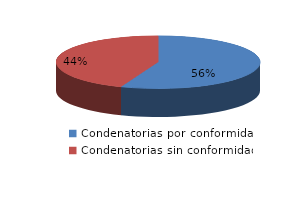
| Category | Series 0 |
|---|---|
| 0 | 19 |
| 1 | 15 |